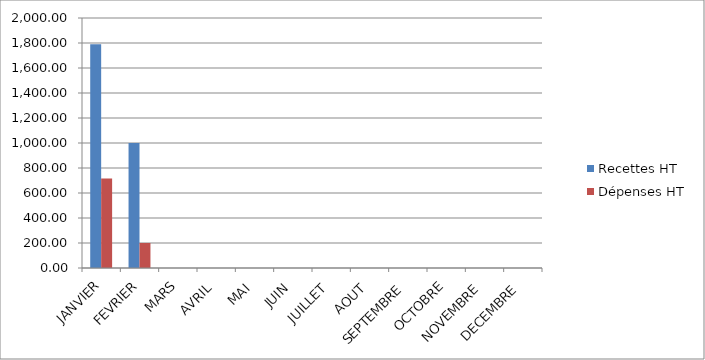
| Category | Recettes HT | Dépenses HT |
|---|---|---|
| JANVIER | 1790 | 716 |
| FEVRIER | 1000 | 200 |
| MARS | 0 | 0 |
| AVRIL | 0 | 0 |
| MAI | 0 | 0 |
| JUIN | 0 | 0 |
| JUILLET | 0 | 0 |
| AOUT | 0 | 0 |
| SEPTEMBRE | 0 | 0 |
| OCTOBRE | 0 | 0 |
| NOVEMBRE | 0 | 0 |
| DECEMBRE | 0 | 0 |